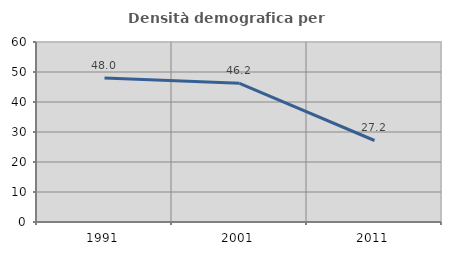
| Category | Densità demografica |
|---|---|
| 1991.0 | 48.035 |
| 2001.0 | 46.215 |
| 2011.0 | 27.168 |